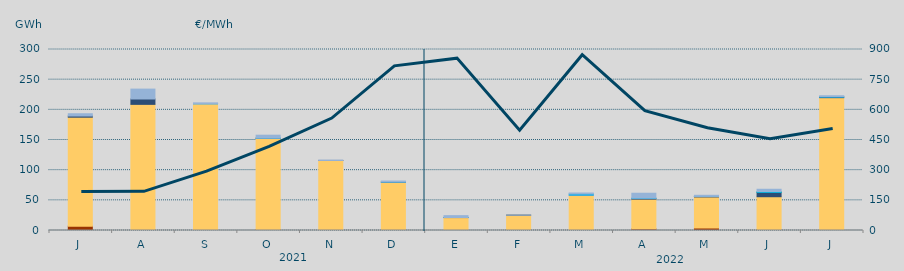
| Category | Carbón | Ciclo Combinado | Cogeneración | Consumo Bombeo | Enlace Península Baleares | Eólica | Hidráulica | Internacionales | Otras Renovables | Residuos no Renovables | Solar fotovoltaica | Solar térmica | Turbinación bombeo |
|---|---|---|---|---|---|---|---|---|---|---|---|---|---|
| J | 7219 | 180584.6 | 0 | 1924.9 | 0 | 0 | 0 | 0 | 0 | 0 | 0 | 0 | 3801.6 |
| A | 0 | 209052.1 | 0 | 8918.2 | 0 | 0 | 0 | 0 | 0 | 0 | 0 | 0 | 16379.8 |
| S | 1190 | 208735.2 | 0 | 0 | 0 | 0 | 34.4 | 0 | 0 | 0 | 0 | 0 | 1592.2 |
| O | 1340 | 151473.6 | 0 | 156.2 | 0 | 0 | 130 | 0 | 0 | 0 | 0 | 0 | 4869.5 |
| N | 165 | 115928.8 | 0 | 16.1 | 30.6 | 0 | 0 | 0 | 0 | 0 | 0 | 0 | 373.4 |
| D | 0 | 79972.3 | 0 | 260.2 | 0 | 0 | 196.2 | 0 | 0 | 0 | 0 | 0 | 1577.4 |
| E | 0 | 21421.9 | 0 | 131 | 0 | 0 | 11.7 | 0 | 0 | 0 | 0 | 0 | 3055.8 |
| F | 0 | 25414.5 | 0 | 90.9 | 0 | 0 | 0 | 0 | 0 | 0 | 0 | 0 | 102.5 |
| M | 0 | 58378.9 | 0 | 0 | 204 | 0 | 2030 | 0 | 0 | 0 | 0 | 0 | 1537.1 |
| A | 2650 | 49297.5 | 0 | 1035.9 | 250 | 0 | 506.1 | 0 | 0 | 0 | 0 | 0 | 8012.5 |
| M | 4151 | 51455.8 | 0 | 906.775 | 0 | 0 | 22.4 | 0 | 0 | 0 | 0 | 0 | 1817.044 |
| J | 865 | 55112.458 | 0 | 7229.298 | 0 | 0.5 | 1411.333 | 0 | 0 | 0 | 0 | 0 | 3733.801 |
| J | 60 | 220106.232 | 0 | 916.465 | 0 | 0 | 693.475 | 0 | 0 | 0 | 0 | 0 | 1555.3 |